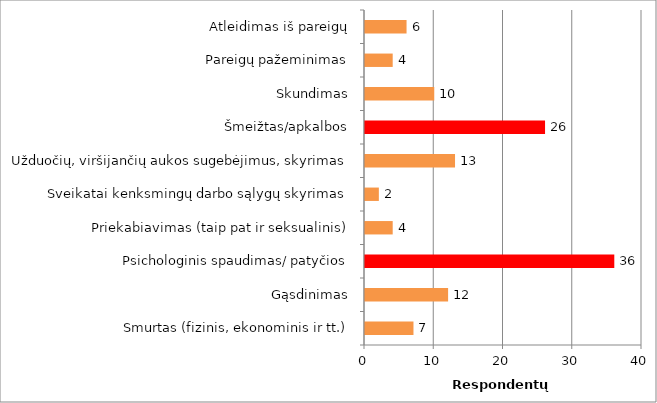
| Category | Series 0 |
|---|---|
| Smurtas (fizinis, ekonominis ir tt.) | 7 |
| Gąsdinimas | 12 |
| Psichologinis spaudimas/ patyčios | 36 |
| Priekabiavimas (taip pat ir seksualinis) | 4 |
| Sveikatai kenksmingų darbo sąlygų skyrimas | 2 |
| Užduočių, viršijančių aukos sugebėjimus, skyrimas | 13 |
| Šmeižtas/apkalbos | 26 |
| Skundimas | 10 |
| Pareigų pažeminimas | 4 |
| Atleidimas iš pareigų | 6 |